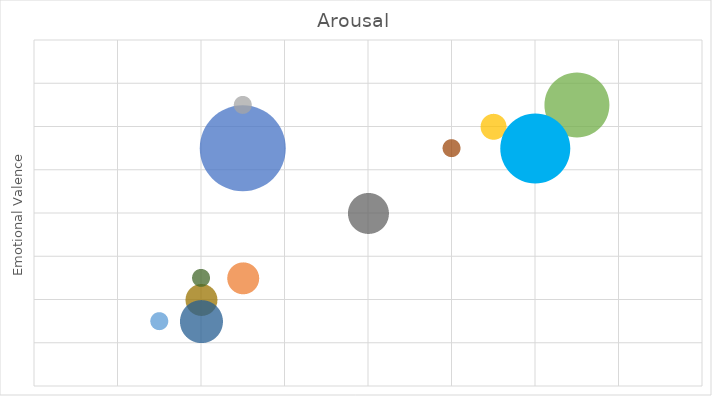
| Category | Arousal |
|---|---|
| -3.0 | 3 |
| -3.0 | -3 |
| -3.0 | 5 |
| 3.0 | 4 |
| -5.0 | -5 |
| 5.0 | 5 |
| 4.0 | 3 |
| 2.0 | 3 |
| 0.0 | 0 |
| -4.0 | -4 |
| -4.0 | -5 |
| -4.0 | -3 |